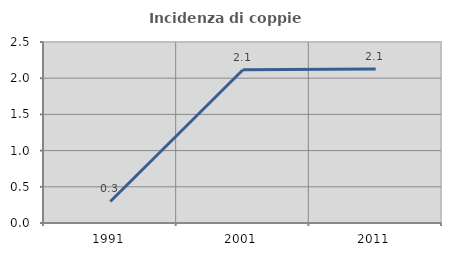
| Category | Incidenza di coppie miste |
|---|---|
| 1991.0 | 0.298 |
| 2001.0 | 2.116 |
| 2011.0 | 2.128 |